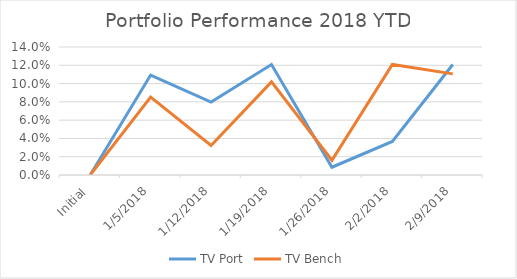
| Category | TV Port | TV Bench |
|---|---|---|
| Initial | 0 | 0 |
| 1/5/2018 | 0.109 | 0.085 |
| 1/12/2018 | 0.08 | 0.032 |
| 1/19/2018 | 0.121 | 0.102 |
| 1/26/2018 | 0.008 | 0.016 |
| 2/2/2018 | 0.037 | 0.121 |
| 2/9/2018 | 0.121 | 0.111 |